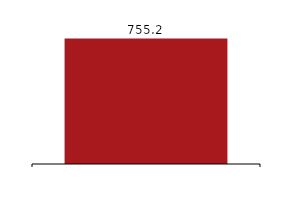
| Category | Loans to customers |
|---|---|
|  | 755175 |